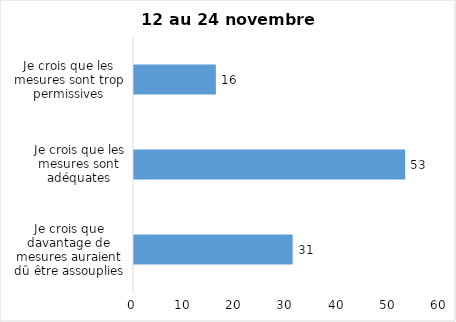
| Category | Series 0 |
|---|---|
| Je crois que davantage de mesures auraient dû être assouplies | 31 |
| Je crois que les mesures sont adéquates | 53 |
| Je crois que les mesures sont trop permissives | 16 |